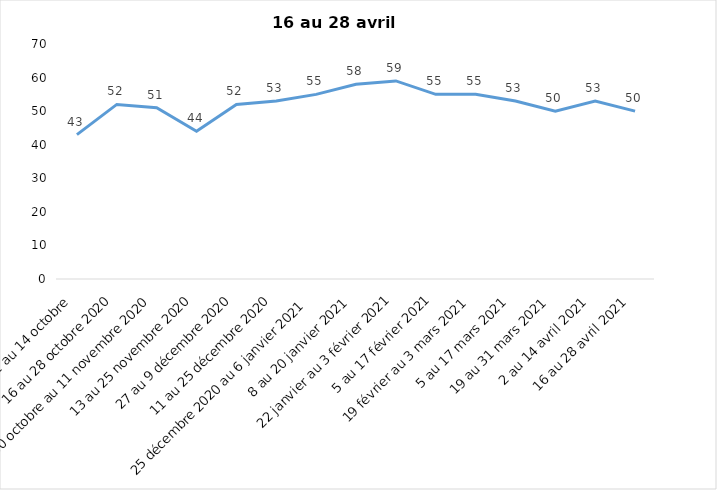
| Category | Toujours aux trois mesures |
|---|---|
| 2 au 14 octobre  | 43 |
| 16 au 28 octobre 2020 | 52 |
| 30 octobre au 11 novembre 2020 | 51 |
| 13 au 25 novembre 2020 | 44 |
| 27 au 9 décembre 2020 | 52 |
| 11 au 25 décembre 2020 | 53 |
| 25 décembre 2020 au 6 janvier 2021 | 55 |
| 8 au 20 janvier 2021 | 58 |
| 22 janvier au 3 février 2021 | 59 |
| 5 au 17 février 2021 | 55 |
| 19 février au 3 mars 2021 | 55 |
| 5 au 17 mars 2021 | 53 |
| 19 au 31 mars 2021 | 50 |
| 2 au 14 avril 2021 | 53 |
| 16 au 28 avril 2021 | 50 |